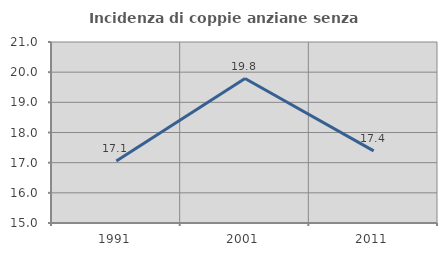
| Category | Incidenza di coppie anziane senza figli  |
|---|---|
| 1991.0 | 17.054 |
| 2001.0 | 19.788 |
| 2011.0 | 17.391 |